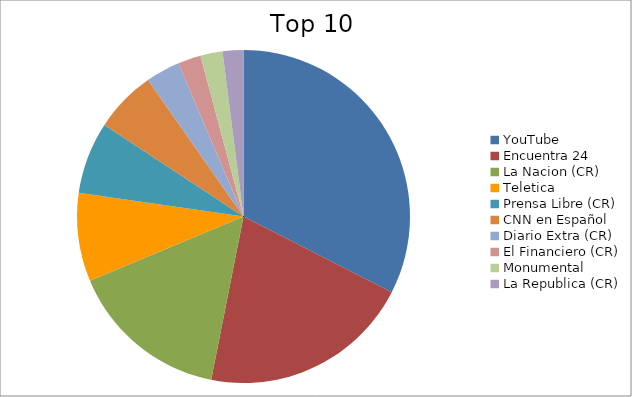
| Category | Series 0 |
|---|---|
| YouTube | 22.68 |
| Encuentra 24 | 14.36 |
| La Nacion (CR) | 10.86 |
| Teletica | 5.99 |
| Prensa Libre (CR) | 4.88 |
| CNN en Español | 4.19 |
| Diario Extra (CR) | 2.32 |
| El Financiero (CR) | 1.56 |
| Monumental | 1.49 |
| La Republica (CR) | 1.41 |